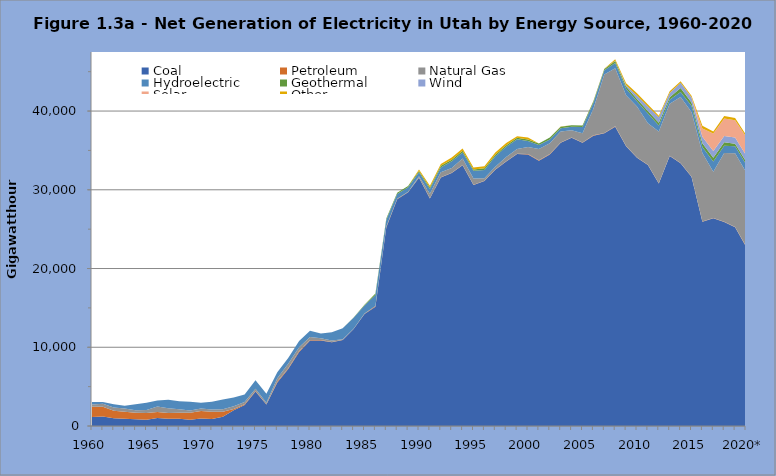
| Category | Coal | Petroleum | Natural Gas | Hydroelectric | Geothermal | Wind | Solar | Other |
|---|---|---|---|---|---|---|---|---|
| 1960 | 1130 | 1314 | 290 | 304.159 | 0 | 0 | 0 | 0 |
| 1961 | 1210 | 1236 | 374 | 230.699 | 0 | 0 | 0 | 0 |
| 1962 | 998 | 934 | 433 | 390.695 | 0 | 0 | 0 | 0 |
| 1963 | 923 | 876 | 413 | 349.936 | 0 | 0 | 0 | 0 |
| 1964 | 855 | 824 | 324 | 761.99 | 0 | 0 | 0 | 0 |
| 1965 | 779 | 866 | 392 | 910.139 | 0 | 0 | 0 | 0 |
| 1966 | 1001 | 765 | 700 | 787.681 | 0 | 0 | 0 | 0 |
| 1967 | 909 | 748 | 611 | 1071.135 | 0 | 0 | 0 | 0 |
| 1968 | 931 | 758 | 444 | 1014.018 | 0 | 0 | 0 | 0 |
| 1969 | 806 | 872 | 287 | 1114.358 | 0 | 0 | 0 | 0 |
| 1970 | 948 | 956 | 307 | 737.977 | 0 | 0 | 0 | 0 |
| 1971 | 894 | 905 | 287 | 981.164 | 0 | 0 | 0 | 0 |
| 1972 | 1165 | 657 | 320 | 1220.017 | 0 | 0 | 0 | 0 |
| 1973 | 2007 | 146 | 342 | 1110.514 | 0 | 0 | 0 | 0 |
| 1974 | 2678 | 69 | 312 | 941.172 | 0 | 0 | 0 | 0 |
| 1975 | 4366 | 82 | 283 | 1074.489 | 0 | 0 | 0 | 0 |
| 1976 | 2739 | 32 | 183 | 1129.586 | 0 | 0 | 0 | 0 |
| 1977 | 5533 | 116 | 421 | 756.835 | 0 | 0 | 0 | 0 |
| 1978 | 7238 | 90 | 565 | 733.607 | 0 | 0 | 0 | 0 |
| 1979 | 9408 | 122 | 458 | 801.952 | 0 | 0 | 0 | 0 |
| 1980 | 10870 | 63 | 358 | 821.467 | 0 | 0 | 0 | 0 |
| 1981 | 10869 | 40 | 230 | 623.003 | 0 | 0 | 0 | 0 |
| 1982 | 10635 | 29 | 203 | 1024.456 | 0 | 0 | 0 | 0 |
| 1983 | 10921 | 40 | 69 | 1393.787 | 0 | 0 | 0 | 0 |
| 1984 | 12321 | 30 | 8 | 1390.72 | 38.3 | 0 | 0 | 0 |
| 1985 | 14229 | 40 | 14 | 1019.005 | 109.515 | 0 | 0 | 0 |
| 1986 | 15155 | 74 | 6 | 1412.579 | 171.605 | 0 | 0 | 0 |
| 1987 | 25221 | 92 | 13 | 856.068 | 163.876 | 0 | 0 | 0 |
| 1988 | 28806 | 59 | 5 | 593.108 | 174.225 | 0 | 0 | 0 |
| 1989 | 29676 | 48 | 37 | 561.675 | 173.153 | 0 | 0 | 0 |
| 1990 | 31522.926 | 51.852 | 146.488 | 508.443 | 151.825 | 0 | 0 | 182.005 |
| 1991 | 28887.6 | 51.314 | 549.984 | 626.965 | 186.241 | 0 | 0 | 203.802 |
| 1992 | 31552.99 | 33.635 | 631.435 | 602.384 | 233.393 | 0 | 0 | 230.326 |
| 1993 | 32125.793 | 36.586 | 606.099 | 860.019 | 186.875 | 0 | 0 | 281.457 |
| 1994 | 33130.664 | 33.1 | 807.259 | 750.438 | 232.631 | 0 | 0 | 280.569 |
| 1995 | 30611.063 | 35.934 | 791.212 | 968.743 | 168.164 | 0 | 0 | 260.694 |
| 1996 | 31100.841 | 47.42 | 323.914 | 1048.957 | 223.311 | 0 | 0 | 238.817 |
| 1997 | 32544.003 | 46.947 | 327.566 | 1344.161 | 203.175 | 0 | 0 | 281.017 |
| 1998 | 33587.674 | 34.948 | 528.257 | 1314.711 | 194.557 | 0 | 0 | 284.783 |
| 1999 | 34533.781 | 30.664 | 610.057 | 1255.142 | 185.926 | 0 | 0 | 199.454 |
| 2000 | 34491.424 | 57.971 | 890.228 | 746.125 | 186.461 | 0 | 0 | 266.967 |
| 2001 | 33679.308 | 57.576 | 1446.077 | 508.405 | 185.989 | 0 | 0 | 9.642 |
| 2002 | 34487.723 | 53.519 | 1380.181 | 457.732 | 247.332 | 0 | 0 | 11.197 |
| 2003 | 35978.648 | 32.866 | 1383.107 | 421.339 | 198.465 | 0 | 0 | 9.241 |
| 2004 | 36617.854 | 32.601 | 909.85 | 449.848 | 194.876 | 0 | 0 | 6.947 |
| 2005 | 35970.405 | 40.909 | 1177.501 | 784.463 | 184.802 | 0 | 0 | 7.05 |
| 2006 | 36855.55 | 62.126 | 3388.55 | 746.783 | 190.608 | 0 | 0 | 19.706 |
| 2007 | 37170.794 | 39.147 | 7424.218 | 538.782 | 163.925 | 0 | 0 | 35.709 |
| 2008 | 38020.367 | 43.612 | 7366.307 | 668.084 | 254.277 | 23.9 | 0 | 202.216 |
| 2009 | 35526.126 | 36.057 | 6444.042 | 835.257 | 279.121 | 159.537 | 0 | 262.805 |
| 2010 | 34057.265 | 50.357 | 6455.396 | 695.512 | 276.949 | 447.68 | 0 | 266.196 |
| 2011 | 33137.663 | 53.949 | 5256.046 | 1230.165 | 330.188 | 572.79 | 0 | 255.348 |
| 2012 | 30799.12 | 39.787 | 6579.604 | 747.786 | 334.638 | 703.911 | 1.619 | 196.495 |
| 2013 | 34284.957 | 26.001 | 6606.423 | 504.996 | 318.908 | 539.806 | 2.1 | 233.56 |
| 2014 | 33376.688 | 24.318 | 8376.42 | 632.823 | 521.582 | 659.951 | 2.235 | 190.51 |
| 2015 | 31656.489 | 19.732 | 8217.665 | 768.773 | 429.517 | 625.917 | 31.859 | 199.167 |
| 2016 | 25939.443 | 31.552 | 8691.32 | 759.542 | 485.094 | 822.282 | 1053.661 | 351.034 |
| 2017 | 26389.567 | 38.413 | 5870.852 | 1293.715 | 480.928 | 858.252 | 2211.105 | 269.044 |
| 2018 | 25912.474 | 36.574 | 8724.119 | 927.097 | 445.737 | 794.555 | 2223.706 | 311.162 |
| 2019 | 25241.026 | 39.777 | 9369.352 | 875.111 | 310.314 | 818.684 | 2186.424 | 276.345 |
| 2020* | 22806.205 | 39.263 | 9425.272 | 977.394 | 354.305 | 788.013 | 2378.88 | 212.166 |